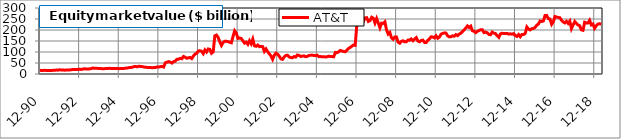
| Category | AT&T |
|---|---|
| 1990-12-31 | 16.798 |
| 1991-01-31 | 15.673 |
| 1991-02-28 | 16.123 |
| 1991-03-29 | 16.835 |
| 1991-04-30 | 16.006 |
| 1991-05-31 | 15.518 |
| 1991-06-28 | 16.064 |
| 1991-07-31 | 16.214 |
| 1991-08-30 | 16.514 |
| 1991-09-30 | 16.754 |
| 1991-10-31 | 18.028 |
| 1991-11-29 | 17.316 |
| 1991-12-31 | 19.377 |
| 1992-01-31 | 18.103 |
| 1992-02-28 | 18.103 |
| 1992-03-31 | 17.241 |
| 1992-04-30 | 18.702 |
| 1992-05-29 | 18.085 |
| 1992-06-30 | 18.31 |
| 1992-07-31 | 19.773 |
| 1992-08-31 | 19.96 |
| 1992-09-30 | 20.555 |
| 1992-10-30 | 20.03 |
| 1992-11-30 | 20.817 |
| 1992-12-31 | 22.174 |
| 1993-01-29 | 20.638 |
| 1993-02-26 | 22.324 |
| 1993-03-31 | 23.41 |
| 1993-04-30 | 23.165 |
| 1993-05-31 | 23.015 |
| 1993-06-30 | 23.251 |
| 1993-07-30 | 24.301 |
| 1993-08-31 | 27.226 |
| 1993-09-30 | 25.73 |
| 1993-10-29 | 26.478 |
| 1993-11-30 | 25.474 |
| 1993-12-31 | 24.875 |
| 1994-01-31 | 25.1 |
| 1994-02-28 | 23.452 |
| 1994-03-31 | 24.201 |
| 1994-04-29 | 24.875 |
| 1994-05-31 | 24.65 |
| 1994-06-30 | 26.11 |
| 1994-07-29 | 25.21 |
| 1994-08-31 | 24.843 |
| 1994-09-30 | 25.577 |
| 1994-10-31 | 25.201 |
| 1994-11-30 | 24.811 |
| 1994-12-30 | 24.211 |
| 1995-01-31 | 25.56 |
| 1995-02-28 | 24.961 |
| 1995-03-31 | 25.186 |
| 1995-04-28 | 26.809 |
| 1995-05-31 | 27.349 |
| 1995-06-30 | 28.944 |
| 1995-07-31 | 29.248 |
| 1995-08-31 | 30.767 |
| 1995-09-29 | 33.516 |
| 1995-10-31 | 34.049 |
| 1995-11-30 | 32.982 |
| 1995-12-29 | 34.914 |
| 1996-01-31 | 34.533 |
| 1996-02-29 | 33.466 |
| 1996-03-29 | 32.055 |
| 1996-04-30 | 30.533 |
| 1996-05-31 | 30.076 |
| 1996-06-28 | 30.001 |
| 1996-07-31 | 29.773 |
| 1996-08-30 | 28.408 |
| 1996-09-30 | 29.322 |
| 1996-10-31 | 29.627 |
| 1996-11-29 | 32.064 |
| 1996-12-31 | 31.315 |
| 1997-01-31 | 33.201 |
| 1997-02-28 | 34.71 |
| 1997-03-31 | 31.692 |
| 1997-04-30 | 50.891 |
| 1997-05-30 | 53.365 |
| 1997-06-30 | 56.444 |
| 1997-07-31 | 53.992 |
| 1997-08-29 | 49.696 |
| 1997-09-30 | 56.151 |
| 1997-10-31 | 58.15 |
| 1997-11-28 | 66.567 |
| 1997-12-31 | 67.14 |
| 1998-01-30 | 71.265 |
| 1998-02-27 | 69.317 |
| 1998-03-31 | 79.764 |
| 1998-04-30 | 76.201 |
| 1998-05-29 | 71.485 |
| 1998-06-30 | 73.554 |
| 1998-07-31 | 75.278 |
| 1998-08-31 | 69.932 |
| 1998-09-30 | 81.53 |
| 1998-10-30 | 90.648 |
| 1998-11-30 | 93.766 |
| 1998-12-31 | 104.891 |
| 1999-01-29 | 105.625 |
| 1999-02-26 | 103.424 |
| 1999-03-31 | 92.598 |
| 1999-04-30 | 109.401 |
| 1999-05-31 | 100.401 |
| 1999-06-30 | 113.903 |
| 1999-07-30 | 112.184 |
| 1999-08-31 | 94.553 |
| 1999-09-30 | 100.455 |
| 1999-10-29 | 173.692 |
| 1999-11-30 | 176.965 |
| 1999-12-31 | 166.305 |
| 2000-01-31 | 146.263 |
| 2000-02-29 | 129.845 |
| 2000-03-31 | 143.199 |
| 2000-04-28 | 148.936 |
| 2000-05-31 | 148.612 |
| 2000-06-30 | 147.124 |
| 2000-07-31 | 144.786 |
| 2000-08-31 | 142.022 |
| 2000-09-29 | 170.086 |
| 2000-10-31 | 196.237 |
| 2000-11-30 | 185.962 |
| 2000-12-29 | 161.632 |
| 2001-01-31 | 163.663 |
| 2001-02-28 | 161.463 |
| 2001-03-30 | 150.776 |
| 2001-04-30 | 140.321 |
| 2001-05-31 | 144.991 |
| 2001-06-29 | 134.921 |
| 2001-07-31 | 151.387 |
| 2001-08-31 | 137.536 |
| 2001-09-28 | 158.413 |
| 2001-10-31 | 128.109 |
| 2001-11-30 | 125.655 |
| 2001-12-31 | 131.672 |
| 2002-01-31 | 124.342 |
| 2002-02-28 | 125.636 |
| 2002-03-29 | 124.308 |
| 2002-04-30 | 103.125 |
| 2002-05-31 | 113.85 |
| 2002-06-28 | 101.266 |
| 2002-07-31 | 91.837 |
| 2002-08-30 | 82.142 |
| 2002-09-30 | 66.736 |
| 2002-10-31 | 85.196 |
| 2002-11-29 | 94.626 |
| 2002-12-31 | 90.011 |
| 2003-01-31 | 81.146 |
| 2003-02-28 | 69.064 |
| 2003-03-31 | 66.607 |
| 2003-04-30 | 77.611 |
| 2003-05-30 | 84.588 |
| 2003-06-30 | 84.887 |
| 2003-07-31 | 77.639 |
| 2003-08-29 | 74.648 |
| 2003-09-30 | 73.95 |
| 2003-10-31 | 79.39 |
| 2003-11-28 | 77.072 |
| 2003-12-31 | 86.309 |
| 2004-01-30 | 84.422 |
| 2004-02-27 | 79.431 |
| 2004-03-31 | 81.184 |
| 2004-04-30 | 82.466 |
| 2004-05-31 | 78.491 |
| 2004-06-30 | 80.313 |
| 2004-07-30 | 83.968 |
| 2004-08-31 | 85.459 |
| 2004-09-30 | 85.989 |
| 2004-10-29 | 83.747 |
| 2004-11-30 | 83.449 |
| 2004-12-31 | 85.438 |
| 2005-01-31 | 78.774 |
| 2005-02-28 | 79.481 |
| 2005-03-31 | 78.258 |
| 2005-04-29 | 78.614 |
| 2005-05-31 | 77.227 |
| 2005-06-30 | 78.449 |
| 2005-07-29 | 80.781 |
| 2005-08-31 | 79.558 |
| 2005-09-30 | 79.195 |
| 2005-10-31 | 78.259 |
| 2005-11-30 | 98.257 |
| 2005-12-30 | 96.601 |
| 2006-01-31 | 100.68 |
| 2006-02-28 | 107.042 |
| 2006-03-31 | 104.909 |
| 2006-04-28 | 101.903 |
| 2006-05-31 | 101.32 |
| 2006-06-30 | 108.435 |
| 2006-07-31 | 116.486 |
| 2006-08-31 | 120.914 |
| 2006-09-29 | 126.468 |
| 2006-10-31 | 131.619 |
| 2006-11-30 | 130.313 |
| 2006-12-29 | 223.035 |
| 2007-01-31 | 234.967 |
| 2007-02-28 | 229.784 |
| 2007-03-30 | 246.206 |
| 2007-04-30 | 238.73 |
| 2007-05-31 | 254.884 |
| 2007-06-29 | 255.87 |
| 2007-07-31 | 238.836 |
| 2007-08-31 | 243.166 |
| 2007-09-28 | 258.047 |
| 2007-10-31 | 253.446 |
| 2007-11-30 | 231.734 |
| 2007-12-31 | 252.051 |
| 2008-01-31 | 232.315 |
| 2008-02-29 | 210.224 |
| 2008-03-31 | 231.168 |
| 2008-04-30 | 229.976 |
| 2008-05-30 | 237.046 |
| 2008-06-30 | 200.152 |
| 2008-07-31 | 181.563 |
| 2008-08-29 | 188.517 |
| 2008-09-30 | 164.532 |
| 2008-10-31 | 157.756 |
| 2008-11-28 | 168.304 |
| 2008-12-31 | 167.95 |
| 2009-01-30 | 145.086 |
| 2009-02-27 | 140.084 |
| 2009-03-31 | 148.511 |
| 2009-04-30 | 151.158 |
| 2009-05-29 | 146.261 |
| 2009-06-30 | 146.556 |
| 2009-07-31 | 154.757 |
| 2009-08-31 | 153.695 |
| 2009-09-30 | 159.359 |
| 2009-10-30 | 151.453 |
| 2009-11-30 | 158.973 |
| 2009-12-31 | 165.405 |
| 2010-01-29 | 149.649 |
| 2010-02-26 | 146.43 |
| 2010-03-31 | 152.51 |
| 2010-04-30 | 153.988 |
| 2010-05-31 | 143.589 |
| 2010-06-30 | 142.939 |
| 2010-07-30 | 153.279 |
| 2010-08-31 | 159.72 |
| 2010-09-30 | 168.997 |
| 2010-10-29 | 168.525 |
| 2010-11-30 | 164.239 |
| 2010-12-31 | 173.636 |
| 2011-01-31 | 162.682 |
| 2011-02-28 | 167.766 |
| 2011-03-31 | 180.949 |
| 2011-04-29 | 184.292 |
| 2011-05-31 | 186.898 |
| 2011-06-30 | 186.01 |
| 2011-07-29 | 173.395 |
| 2011-08-31 | 168.772 |
| 2011-09-30 | 169.009 |
| 2011-10-31 | 173.691 |
| 2011-11-30 | 171.735 |
| 2011-12-30 | 179.202 |
| 2012-01-31 | 174.364 |
| 2012-02-29 | 181.36 |
| 2012-03-30 | 185.155 |
| 2012-04-30 | 192.951 |
| 2012-05-31 | 200.339 |
| 2012-06-29 | 209.074 |
| 2012-07-31 | 218.76 |
| 2012-08-31 | 211.376 |
| 2012-09-28 | 217.491 |
| 2012-10-31 | 196.471 |
| 2012-11-30 | 193.858 |
| 2012-12-31 | 188.135 |
| 2013-01-31 | 194.163 |
| 2013-02-28 | 197.204 |
| 2013-03-29 | 201.487 |
| 2013-04-30 | 201.535 |
| 2013-05-31 | 188.246 |
| 2013-06-28 | 190.452 |
| 2013-07-31 | 187.319 |
| 2013-08-30 | 179.671 |
| 2013-09-30 | 178.57 |
| 2013-10-31 | 190.702 |
| 2013-11-30 | 185.486 |
| 2013-12-31 | 183.746 |
| 2014-01-31 | 173.682 |
| 2014-02-28 | 166.255 |
| 2014-03-31 | 182.189 |
| 2014-04-30 | 185.283 |
| 2014-05-31 | 184.089 |
| 2014-06-30 | 183.554 |
| 2014-07-31 | 184.57 |
| 2014-08-31 | 181.302 |
| 2014-09-30 | 182.754 |
| 2014-10-31 | 180.715 |
| 2014-11-30 | 183.516 |
| 2014-12-31 | 174.231 |
| 2015-01-30 | 170.756 |
| 2015-02-27 | 179.372 |
| 2015-03-31 | 169.553 |
| 2015-04-30 | 179.886 |
| 2015-05-29 | 179.366 |
| 2015-06-30 | 184.455 |
| 2015-07-31 | 213.686 |
| 2015-08-31 | 204.213 |
| 2015-09-30 | 200.4 |
| 2015-10-30 | 206.12 |
| 2015-11-30 | 207.138 |
| 2015-12-31 | 211.69 |
| 2016-01-29 | 221.841 |
| 2016-02-29 | 227.287 |
| 2016-03-31 | 240.943 |
| 2016-04-29 | 238.79 |
| 2016-05-31 | 241.025 |
| 2016-06-30 | 266.021 |
| 2016-07-29 | 266.513 |
| 2016-08-31 | 251.494 |
| 2016-09-30 | 249.833 |
| 2016-10-31 | 225.927 |
| 2016-11-30 | 237.227 |
| 2016-12-30 | 261.177 |
| 2017-01-31 | 258.884 |
| 2017-02-28 | 257.155 |
| 2017-03-31 | 255.678 |
| 2017-04-28 | 243.864 |
| 2017-05-31 | 236.882 |
| 2017-06-30 | 231.964 |
| 2017-07-31 | 239.46 |
| 2017-08-31 | 230.004 |
| 2017-09-29 | 240.504 |
| 2017-10-31 | 206.577 |
| 2017-11-30 | 223.337 |
| 2017-12-29 | 238.684 |
| 2018-01-31 | 229.906 |
| 2018-02-28 | 223.038 |
| 2018-03-30 | 219.044 |
| 2018-04-30 | 200.811 |
| 2018-05-31 | 198.583 |
| 2018-06-29 | 235.238 |
| 2018-07-31 | 232.166 |
| 2018-08-31 | 231.948 |
| 2018-09-28 | 243.858 |
| 2018-10-31 | 223.289 |
| 2018-11-30 | 227.365 |
| 2018-12-31 | 207.714 |
| 2019-01-31 | 219.144 |
| 2019-02-28 | 226.696 |
| 2019-03-29 | 228.445 |
| 2019-04-30 | 225.946 |